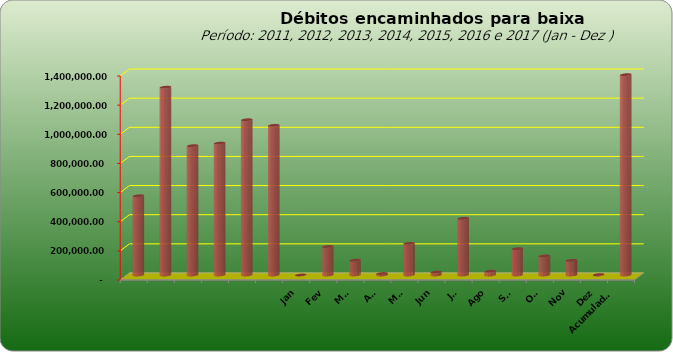
| Category |  543.796,20  |
|---|---|
|  | 543796.2 |
|  | 1289053.69 |
|  | 887573.08 |
|  | 905052.31 |
|  | 1065434.28 |
|  | 1027209.41 |
| Jan | 0 |
| Fev | 195564.55 |
| Mar | 101757.11 |
| Abr | 10195.55 |
| Mai | 217067.29 |
| Jun | 19848.93 |
| Jul | 389298.76 |
| Ago | 26234.02 |
| Set | 180838.97 |
| Out | 130731.84 |
| Nov | 100594.34 |
| Dez | 2669 |
| Acumulado
2016 | 1374800.36 |